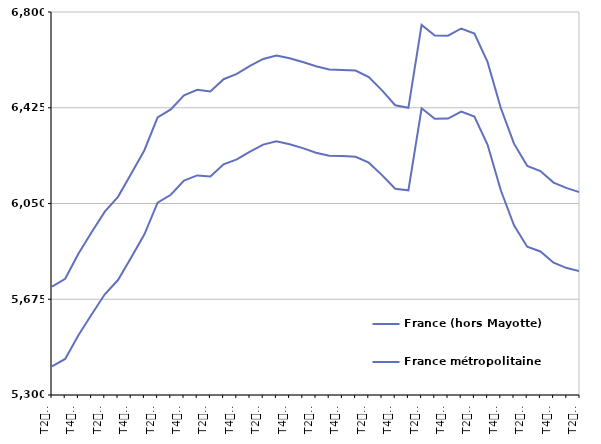
| Category | France (hors Mayotte) | France métropolitaine |
|---|---|---|
| T2
2013 | 5724.7 | 5411.9 |
| T3
2013 | 5755.1 | 5441.1 |
| T4
2013 | 5853.1 | 5533.8 |
| T1
2014 | 5937.5 | 5615.5 |
| T2
2014 | 6018.1 | 5694.5 |
| T3
2014 | 6076 | 5750.2 |
| T4
2014 | 6166.1 | 5838.8 |
| T1
2015 | 6258.7 | 5929.3 |
| T2
2015 | 6386.9 | 6053.4 |
| T3
2015 | 6418.5 | 6084.3 |
| T4
2015 | 6474 | 6139.8 |
| T1
2016 | 6495.5 | 6160 |
| T2
2016 | 6488.7 | 6156.1 |
| T3
2016 | 6536.7 | 6203.6 |
| T4
2016 | 6557.4 | 6222.6 |
| T1
2017 | 6588.9 | 6252.7 |
| T2
2017 | 6616.1 | 6280.5 |
| T3
2017 | 6629.5 | 6293.9 |
| T4
2017 | 6618.6 | 6281.7 |
| T1
2018 | 6604.1 | 6266.8 |
| T2
2018 | 6587.4 | 6249 |
| T3
2018 | 6574.5 | 6237.1 |
| T4
2018 | 6573.2 | 6235.6 |
| T1
2019 | 6570.9 | 6232.7 |
| T2
2019 | 6545 | 6209.8 |
| T3
2019 | 6493.3 | 6161.2 |
| T4
2019 | 6434.9 | 6107.7 |
| T1
2020 | 6424.8 | 6101.7 |
| T2
2020 | 6749.3 | 6423 |
| T3
2020 | 6708.1 | 6381.6 |
| T4
2020 | 6707.4 | 6382.5 |
| T1
2021 | 6735.4 | 6409.6 |
| T2
2021 | 6715.9 | 6390.5 |
| T3
2021 | 6603.7 | 6279.8 |
| T4
2021 | 6424.1 | 6101.7 |
| T1
2022 | 6284.4 | 5964.6 |
| T2
2022 | 6197.4 | 5881 |
| T3
2022 | 6177.3 | 5862.1 |
| T4
2022 | 6132 | 5818.3 |
| T1
2023 | 6110.1 | 5797.1 |
| T2
2023 | 6093.9 | 5784.6 |